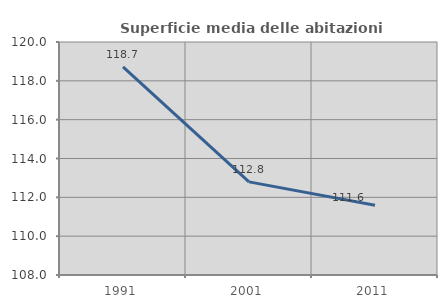
| Category | Superficie media delle abitazioni occupate |
|---|---|
| 1991.0 | 118.723 |
| 2001.0 | 112.797 |
| 2011.0 | 111.595 |